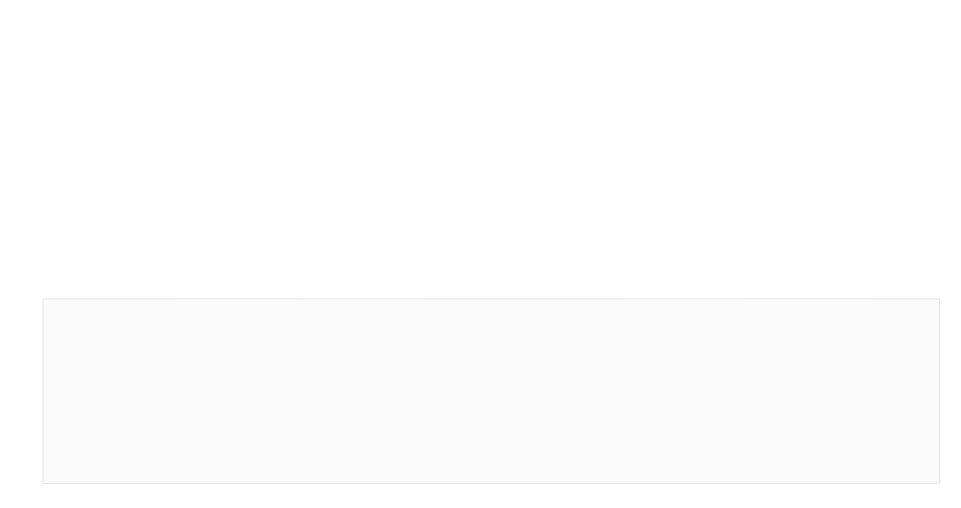
| Category | Series 0 | Series 1 |
|---|---|---|
| 0 | 97000 | 153000 |